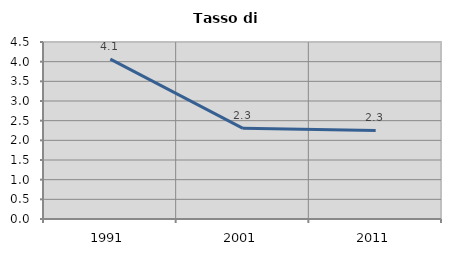
| Category | Tasso di disoccupazione   |
|---|---|
| 1991.0 | 4.065 |
| 2001.0 | 2.305 |
| 2011.0 | 2.253 |